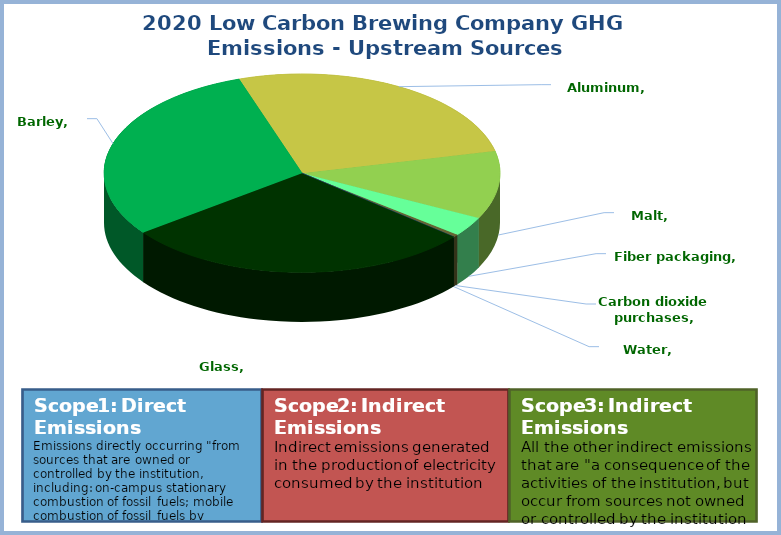
| Category | Series 0 |
|---|---|
| Glass | 0.287 |
| Barley | 0.301 |
| Aluminum | 0.266 |
| Malt | 0.11 |
| Fiber packaging | 0.032 |
| Carbon dioxide purchases | 0.004 |
| Water | 0 |